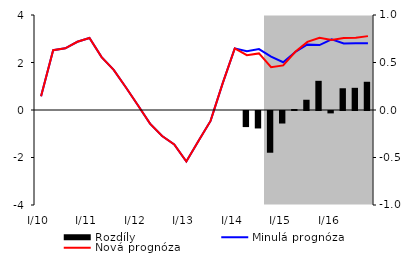
| Category | Rozdíly |
|---|---|
| 0 | 0 |
| 1 | 0 |
| 2 | 0 |
| 3 | 0 |
| 4 | 0 |
| 5 | 0 |
| 6 | 0 |
| 7 | 0 |
| 8 | 0 |
| 9 | 0 |
| 10 | 0 |
| 11 | 0 |
| 12 | 0 |
| 13 | 0 |
| 14 | 0 |
| 15 | 0 |
| 16 | 0 |
| 17 | -0.169 |
| 18 | -0.184 |
| 19 | -0.439 |
| 20 | -0.132 |
| 21 | 0.01 |
| 22 | 0.108 |
| 23 | 0.307 |
| 24 | -0.025 |
| 25 | 0.229 |
| 26 | 0.233 |
| 27 | 0.297 |